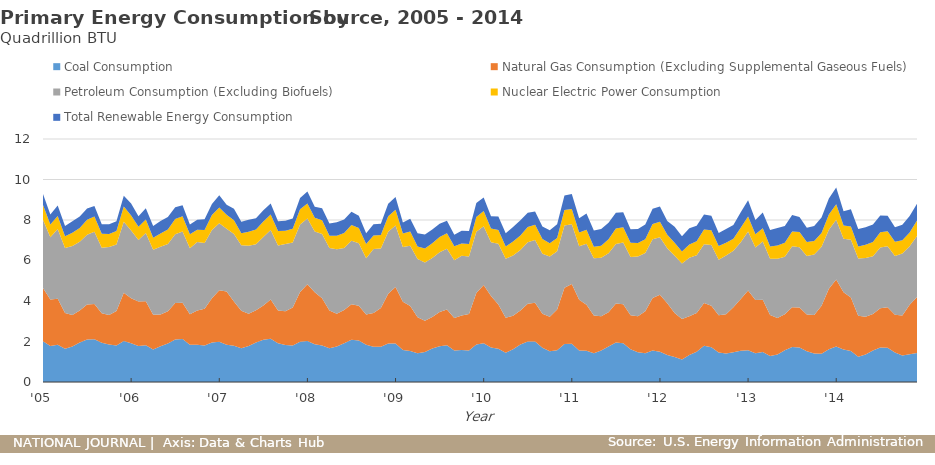
| Category | Coal Consumption | Natural Gas Consumption (Excluding Supplemental Gaseous Fuels) | Petroleum Consumption (Excluding Biofuels) | Nuclear Electric Power Consumption | Total Renewable Energy Consumption |
|---|---|---|---|---|---|
| 2005-01-01 | 2.013 | 2.629 | 3.371 | 0.729 | 0.54 |
| 2005-02-01 | 1.776 | 2.301 | 3.07 | 0.636 | 0.491 |
| 2005-03-01 | 1.845 | 2.261 | 3.444 | 0.642 | 0.525 |
| 2005-04-01 | 1.637 | 1.768 | 3.211 | 0.579 | 0.514 |
| 2005-05-01 | 1.749 | 1.561 | 3.401 | 0.657 | 0.568 |
| 2005-06-01 | 1.954 | 1.572 | 3.395 | 0.69 | 0.562 |
| 2005-07-01 | 2.094 | 1.728 | 3.448 | 0.742 | 0.562 |
| 2005-08-01 | 2.117 | 1.737 | 3.572 | 0.745 | 0.517 |
| 2005-09-01 | 1.937 | 1.457 | 3.236 | 0.696 | 0.465 |
| 2005-10-01 | 1.852 | 1.462 | 3.353 | 0.639 | 0.478 |
| 2005-11-01 | 1.802 | 1.704 | 3.289 | 0.657 | 0.488 |
| 2005-12-01 | 2.021 | 2.385 | 3.513 | 0.749 | 0.531 |
| 2006-01-01 | 1.91 | 2.22 | 3.346 | 0.75 | 0.592 |
| 2006-02-01 | 1.781 | 2.199 | 3.029 | 0.653 | 0.529 |
| 2006-03-01 | 1.814 | 2.18 | 3.37 | 0.665 | 0.553 |
| 2006-04-01 | 1.603 | 1.723 | 3.203 | 0.601 | 0.58 |
| 2006-05-01 | 1.766 | 1.565 | 3.352 | 0.655 | 0.618 |
| 2006-06-01 | 1.903 | 1.588 | 3.329 | 0.714 | 0.608 |
| 2006-07-01 | 2.102 | 1.802 | 3.394 | 0.753 | 0.574 |
| 2006-08-01 | 2.123 | 1.795 | 3.519 | 0.751 | 0.537 |
| 2006-09-01 | 1.843 | 1.497 | 3.26 | 0.695 | 0.484 |
| 2006-10-01 | 1.84 | 1.684 | 3.392 | 0.6 | 0.497 |
| 2006-11-01 | 1.807 | 1.809 | 3.253 | 0.641 | 0.524 |
| 2006-12-01 | 1.956 | 2.176 | 3.375 | 0.736 | 0.55 |
| 2007-01-01 | 1.991 | 2.535 | 3.318 | 0.776 | 0.6 |
| 2007-02-01 | 1.835 | 2.63 | 3.11 | 0.684 | 0.493 |
| 2007-03-01 | 1.795 | 2.18 | 3.333 | 0.674 | 0.578 |
| 2007-04-01 | 1.665 | 1.853 | 3.23 | 0.601 | 0.566 |
| 2007-05-01 | 1.775 | 1.598 | 3.36 | 0.682 | 0.594 |
| 2007-06-01 | 1.947 | 1.592 | 3.264 | 0.723 | 0.558 |
| 2007-07-01 | 2.083 | 1.7 | 3.375 | 0.763 | 0.561 |
| 2007-08-01 | 2.134 | 1.942 | 3.428 | 0.763 | 0.542 |
| 2007-09-01 | 1.908 | 1.628 | 3.209 | 0.709 | 0.482 |
| 2007-10-01 | 1.832 | 1.666 | 3.32 | 0.647 | 0.504 |
| 2007-11-01 | 1.801 | 1.878 | 3.21 | 0.681 | 0.503 |
| 2007-12-01 | 1.984 | 2.459 | 3.334 | 0.755 | 0.552 |
| 2008-01-01 | 2.026 | 2.802 | 3.247 | 0.739 | 0.597 |
| 2008-02-01 | 1.867 | 2.565 | 2.994 | 0.681 | 0.544 |
| 2008-03-01 | 1.801 | 2.334 | 3.174 | 0.676 | 0.598 |
| 2008-04-01 | 1.667 | 1.868 | 3.086 | 0.599 | 0.607 |
| 2008-05-01 | 1.754 | 1.615 | 3.181 | 0.678 | 0.665 |
| 2008-06-01 | 1.919 | 1.643 | 3.06 | 0.735 | 0.674 |
| 2008-07-01 | 2.092 | 1.751 | 3.138 | 0.777 | 0.646 |
| 2008-08-01 | 2.046 | 1.724 | 3.082 | 0.759 | 0.597 |
| 2008-09-01 | 1.836 | 1.495 | 2.781 | 0.701 | 0.533 |
| 2008-10-01 | 1.737 | 1.674 | 3.163 | 0.657 | 0.555 |
| 2008-11-01 | 1.741 | 1.914 | 2.943 | 0.663 | 0.551 |
| 2008-12-01 | 1.901 | 2.459 | 3.06 | 0.762 | 0.62 |
| 2009-01-01 | 1.904 | 2.792 | 3.038 | 0.775 | 0.625 |
| 2009-02-01 | 1.582 | 2.385 | 2.699 | 0.672 | 0.539 |
| 2009-03-01 | 1.536 | 2.219 | 2.973 | 0.703 | 0.625 |
| 2009-04-01 | 1.422 | 1.779 | 2.867 | 0.621 | 0.656 |
| 2009-05-01 | 1.486 | 1.537 | 2.883 | 0.684 | 0.698 |
| 2009-06-01 | 1.655 | 1.561 | 2.902 | 0.729 | 0.688 |
| 2009-07-01 | 1.76 | 1.695 | 2.948 | 0.763 | 0.646 |
| 2009-08-01 | 1.811 | 1.775 | 2.999 | 0.756 | 0.618 |
| 2009-09-01 | 1.555 | 1.609 | 2.85 | 0.688 | 0.57 |
| 2009-10-01 | 1.58 | 1.702 | 2.956 | 0.607 | 0.63 |
| 2009-11-01 | 1.55 | 1.814 | 2.83 | 0.618 | 0.64 |
| 2009-12-01 | 1.852 | 2.548 | 3.014 | 0.74 | 0.689 |
| 2010-01-01 | 1.917 | 2.869 | 2.904 | 0.758 | 0.66 |
| 2010-02-01 | 1.709 | 2.533 | 2.659 | 0.682 | 0.603 |
| 2010-03-01 | 1.638 | 2.187 | 3.005 | 0.676 | 0.671 |
| 2010-04-01 | 1.446 | 1.725 | 2.917 | 0.602 | 0.655 |
| 2010-05-01 | 1.621 | 1.649 | 2.975 | 0.697 | 0.713 |
| 2010-06-01 | 1.848 | 1.682 | 2.985 | 0.714 | 0.753 |
| 2010-07-01 | 1.999 | 1.862 | 3.044 | 0.752 | 0.699 |
| 2010-08-01 | 1.995 | 1.916 | 3.102 | 0.748 | 0.658 |
| 2010-09-01 | 1.697 | 1.67 | 2.964 | 0.725 | 0.62 |
| 2010-10-01 | 1.522 | 1.697 | 2.976 | 0.656 | 0.641 |
| 2010-11-01 | 1.564 | 2.013 | 2.881 | 0.655 | 0.674 |
| 2010-12-01 | 1.879 | 2.771 | 3.076 | 0.77 | 0.718 |
| 2011-01-01 | 1.888 | 2.947 | 2.952 | 0.761 | 0.73 |
| 2011-02-01 | 1.56 | 2.502 | 2.648 | 0.678 | 0.702 |
| 2011-03-01 | 1.544 | 2.274 | 3.012 | 0.687 | 0.804 |
| 2011-04-01 | 1.421 | 1.86 | 2.827 | 0.571 | 0.803 |
| 2011-05-01 | 1.55 | 1.699 | 2.885 | 0.597 | 0.825 |
| 2011-06-01 | 1.757 | 1.689 | 2.918 | 0.683 | 0.823 |
| 2011-07-01 | 1.953 | 1.927 | 2.939 | 0.757 | 0.781 |
| 2011-08-01 | 1.916 | 1.928 | 3.046 | 0.746 | 0.74 |
| 2011-09-01 | 1.614 | 1.687 | 2.872 | 0.7 | 0.669 |
| 2011-10-01 | 1.475 | 1.777 | 2.946 | 0.663 | 0.698 |
| 2011-11-01 | 1.425 | 2.071 | 2.878 | 0.675 | 0.726 |
| 2011-12-01 | 1.556 | 2.592 | 2.901 | 0.752 | 0.759 |
| 2012-01-01 | 1.491 | 2.817 | 2.846 | 0.758 | 0.749 |
| 2012-02-01 | 1.338 | 2.556 | 2.712 | 0.669 | 0.68 |
| 2012-03-01 | 1.233 | 2.174 | 2.827 | 0.647 | 0.784 |
| 2012-04-01 | 1.112 | 1.995 | 2.748 | 0.585 | 0.76 |
| 2012-05-01 | 1.329 | 1.914 | 2.898 | 0.651 | 0.802 |
| 2012-06-01 | 1.498 | 1.908 | 2.856 | 0.683 | 0.771 |
| 2012-07-01 | 1.79 | 2.114 | 2.899 | 0.724 | 0.743 |
| 2012-08-01 | 1.718 | 2.052 | 2.994 | 0.729 | 0.717 |
| 2012-09-01 | 1.456 | 1.845 | 2.734 | 0.676 | 0.642 |
| 2012-10-01 | 1.403 | 1.941 | 2.908 | 0.626 | 0.682 |
| 2012-11-01 | 1.472 | 2.215 | 2.792 | 0.594 | 0.683 |
| 2012-12-01 | 1.539 | 2.559 | 2.801 | 0.719 | 0.763 |
| 2013-01-01 | 1.572 | 2.952 | 2.906 | 0.746 | 0.794 |
| 2013-02-01 | 1.414 | 2.632 | 2.601 | 0.642 | 0.71 |
| 2013-03-01 | 1.481 | 2.584 | 2.87 | 0.658 | 0.774 |
| 2013-04-01 | 1.287 | 2.016 | 2.789 | 0.593 | 0.822 |
| 2013-05-01 | 1.364 | 1.795 | 2.923 | 0.657 | 0.86 |
| 2013-06-01 | 1.564 | 1.785 | 2.833 | 0.694 | 0.828 |
| 2013-07-01 | 1.723 | 1.974 | 3.002 | 0.737 | 0.814 |
| 2013-08-01 | 1.701 | 1.975 | 2.981 | 0.745 | 0.744 |
| 2013-09-01 | 1.52 | 1.81 | 2.898 | 0.688 | 0.704 |
| 2013-10-01 | 1.402 | 1.912 | 2.986 | 0.66 | 0.746 |
| 2013-11-01 | 1.394 | 2.375 | 2.912 | 0.679 | 0.761 |
| 2013-12-01 | 1.616 | 2.995 | 2.911 | 0.745 | 0.799 |
| 2014-01-01 | 1.748 | 3.317 | 2.948 | 0.764 | 0.822 |
| 2014-02-01 | 1.601 | 2.835 | 2.636 | 0.655 | 0.707 |
| 2014-03-01 | 1.525 | 2.645 | 2.851 | 0.652 | 0.854 |
| 2014-04-01 | 1.241 | 2.025 | 2.835 | 0.589 | 0.863 |
| 2014-05-01 | 1.358 | 1.87 | 2.896 | 0.658 | 0.859 |
| 2014-06-01 | 1.56 | 1.803 | 2.843 | 0.712 | 0.855 |
| 2014-07-01 | 1.7 | 1.942 | 3.004 | 0.752 | 0.822 |
| 2014-08-01 | 1.695 | 1.996 | 3.009 | 0.743 | 0.762 |
| 2014-09-01 | 1.457 | 1.869 | 2.9 | 0.706 | 0.714 |
| 2014-10-01 | 1.307 | 1.976 | 3.059 | 0.652 | 0.767 |
| 2014-11-01 | 1.37 | 2.439 | 2.896 | 0.681 | 0.809 |
| 2014-12-01 | 1.432 | 2.772 | 3.003 | 0.767 | 0.823 |